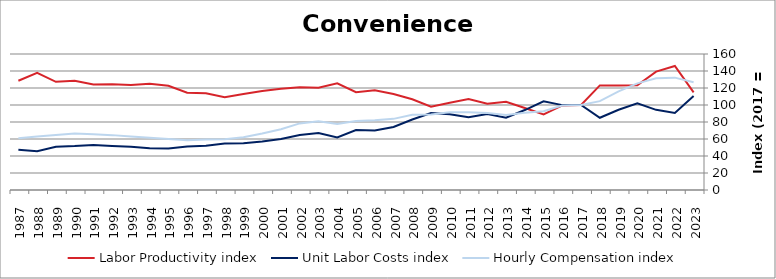
| Category | Labor Productivity index | Unit Labor Costs index | Hourly Compensation index |
|---|---|---|---|
| 2023.0 | 114.795 | 110.474 | 126.819 |
| 2022.0 | 145.978 | 90.552 | 132.185 |
| 2021.0 | 139.327 | 94.289 | 131.37 |
| 2020.0 | 123.09 | 101.887 | 125.413 |
| 2019.0 | 123.004 | 94.344 | 116.046 |
| 2018.0 | 123.031 | 84.995 | 104.57 |
| 2017.0 | 100 | 100 | 100 |
| 2016.0 | 99.506 | 99.866 | 99.373 |
| 2015.0 | 88.862 | 104.374 | 92.749 |
| 2014.0 | 96.513 | 94.079 | 90.798 |
| 2013.0 | 103.857 | 85.103 | 88.385 |
| 2012.0 | 101.474 | 89.318 | 90.634 |
| 2011.0 | 107.11 | 85.479 | 91.556 |
| 2010.0 | 102.546 | 89.08 | 91.349 |
| 2009.0 | 98.057 | 90.615 | 88.854 |
| 2008.0 | 106.68 | 82.956 | 88.497 |
| 2007.0 | 112.946 | 74.098 | 83.691 |
| 2006.0 | 117.378 | 69.965 | 82.123 |
| 2005.0 | 115.082 | 70.49 | 81.121 |
| 2004.0 | 125.602 | 61.842 | 77.675 |
| 2003.0 | 120.338 | 67.111 | 80.76 |
| 2002.0 | 120.951 | 64.782 | 78.355 |
| 2001.0 | 119.027 | 60.001 | 71.417 |
| 2000.0 | 116.464 | 57.055 | 66.449 |
| 1999.0 | 112.875 | 54.933 | 62.005 |
| 1998.0 | 109.009 | 54.662 | 59.586 |
| 1997.0 | 113.829 | 52.115 | 59.322 |
| 1996.0 | 114.477 | 51.092 | 58.489 |
| 1995.0 | 122.534 | 48.933 | 59.96 |
| 1994.0 | 124.943 | 49.089 | 61.334 |
| 1993.0 | 123.624 | 50.849 | 62.861 |
| 1992.0 | 124.491 | 51.856 | 64.556 |
| 1991.0 | 124.012 | 52.853 | 65.544 |
| 1990.0 | 128.628 | 51.625 | 66.404 |
| 1989.0 | 127.252 | 50.933 | 64.813 |
| 1988.0 | 137.966 | 45.715 | 63.071 |
| 1987.0 | 128.548 | 47.389 | 60.917 |